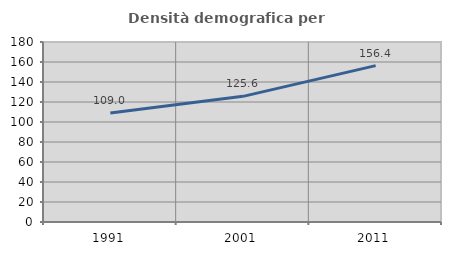
| Category | Densità demografica |
|---|---|
| 1991.0 | 108.99 |
| 2001.0 | 125.645 |
| 2011.0 | 156.355 |